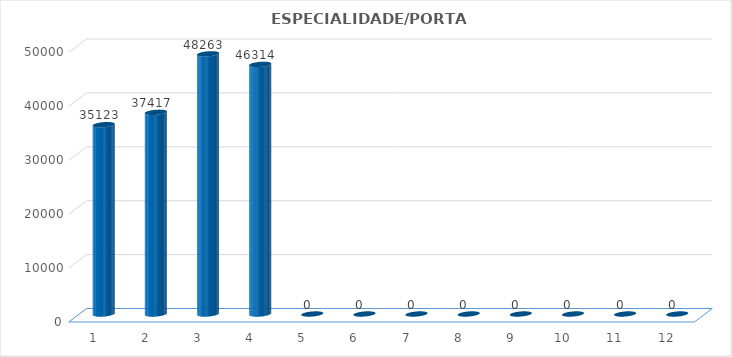
| Category | Series 0 |
|---|---|
| 0 | 35123 |
| 1 | 37417 |
| 2 | 48263 |
| 3 | 46314 |
| 4 | 0 |
| 5 | 0 |
| 6 | 0 |
| 7 | 0 |
| 8 | 0 |
| 9 | 0 |
| 10 | 0 |
| 11 | 0 |